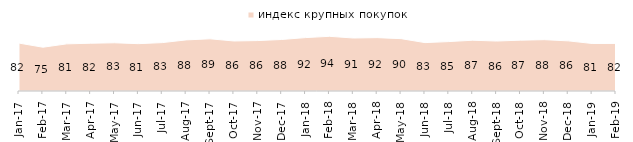
| Category | индекс крупных покупок |
|---|---|
| 2017-01-01 | 82.1 |
| 2017-02-01 | 75.05 |
| 2017-03-01 | 80.8 |
| 2017-04-01 | 81.9 |
| 2017-05-01 | 82.65 |
| 2017-06-01 | 81.15 |
| 2017-07-01 | 82.95 |
| 2017-08-01 | 87.6 |
| 2017-09-01 | 89.45 |
| 2017-10-01 | 85.75 |
| 2017-11-01 | 86.45 |
| 2017-12-01 | 88.3 |
| 2018-01-01 | 91.55 |
| 2018-02-01 | 93.75 |
| 2018-03-01 | 90.85 |
| 2018-04-01 | 91.5 |
| 2018-05-01 | 89.75 |
| 2018-06-01 | 82.95 |
| 2018-07-01 | 84.7 |
| 2018-08-01 | 87.05 |
| 2018-09-01 | 85.65 |
| 2018-10-01 | 87.15 |
| 2018-11-01 | 87.974 |
| 2018-12-01 | 85.95 |
| 2019-01-01 | 81.45 |
| 2019-02-01 | 81.55 |